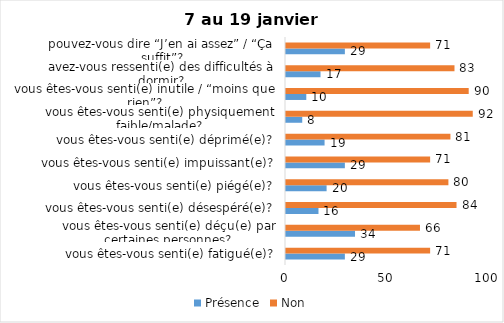
| Category | Présence | Non |
|---|---|---|
| vous êtes-vous senti(e) fatigué(e)? | 29 | 71 |
| vous êtes-vous senti(e) déçu(e) par certaines personnes? | 34 | 66 |
| vous êtes-vous senti(e) désespéré(e)? | 16 | 84 |
| vous êtes-vous senti(e) piégé(e)? | 20 | 80 |
| vous êtes-vous senti(e) impuissant(e)? | 29 | 71 |
| vous êtes-vous senti(e) déprimé(e)? | 19 | 81 |
| vous êtes-vous senti(e) physiquement faible/malade? | 8 | 92 |
| vous êtes-vous senti(e) inutile / “moins que rien”? | 10 | 90 |
| avez-vous ressenti(e) des difficultés à dormir? | 17 | 83 |
| pouvez-vous dire “J’en ai assez” / “Ça suffit”? | 29 | 71 |